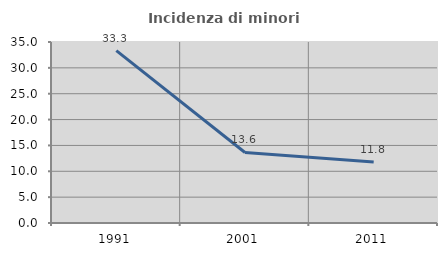
| Category | Incidenza di minori stranieri |
|---|---|
| 1991.0 | 33.333 |
| 2001.0 | 13.636 |
| 2011.0 | 11.801 |